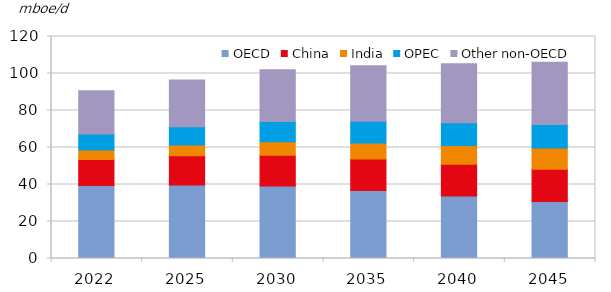
| Category | OECD | China | India | OPEC | Other non-OECD |
|---|---|---|---|---|---|
| 2022.0 | 39.473 | 14.052 | 5.121 | 8.59 | 23.414 |
| 2025.0 | 39.705 | 15.802 | 5.837 | 9.852 | 25.25 |
| 2030.0 | 39.125 | 16.655 | 7.286 | 11.039 | 27.878 |
| 2035.0 | 36.757 | 16.996 | 8.692 | 11.727 | 30.084 |
| 2040.0 | 33.734 | 17.255 | 10.097 | 12.263 | 31.98 |
| 2045.0 | 30.765 | 17.446 | 11.585 | 12.662 | 33.612 |